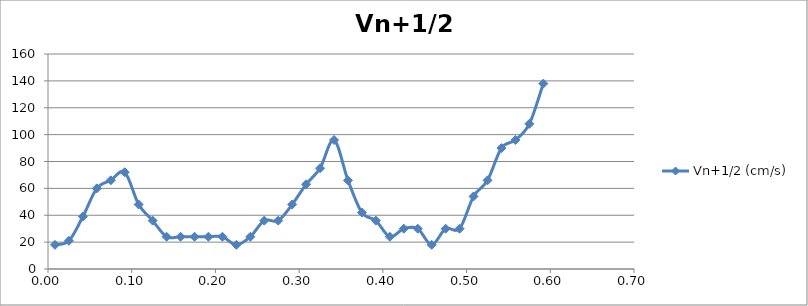
| Category | Vn+1/2 (cm/s) |
|---|---|
| 0.00833333333333333 | 18 |
| 0.025 | 21 |
| 0.0416666666666667 | 39 |
| 0.0583333333333333 | 60 |
| 0.075 | 66 |
| 0.0916666666666666 | 72 |
| 0.108333333333333 | 48 |
| 0.125 | 36 |
| 0.141666666666667 | 24 |
| 0.158333333333333 | 24 |
| 0.175 | 24 |
| 0.191666666666667 | 24 |
| 0.208333333333333 | 24 |
| 0.225 | 18 |
| 0.241666666666667 | 24 |
| 0.258333333333333 | 36 |
| 0.275 | 36 |
| 0.291666666666667 | 48 |
| 0.308333333333333 | 63 |
| 0.325 | 75 |
| 0.341666666666667 | 96 |
| 0.358333333333333 | 66 |
| 0.375 | 42 |
| 0.391666666666667 | 36 |
| 0.408333333333333 | 24 |
| 0.425 | 30 |
| 0.441666666666667 | 30 |
| 0.458333333333333 | 18 |
| 0.475 | 30 |
| 0.491666666666667 | 30 |
| 0.508333333333333 | 54 |
| 0.525 | 66 |
| 0.541666666666667 | 90 |
| 0.558333333333333 | 96 |
| 0.575 | 108 |
| 0.591666666666667 | 138 |